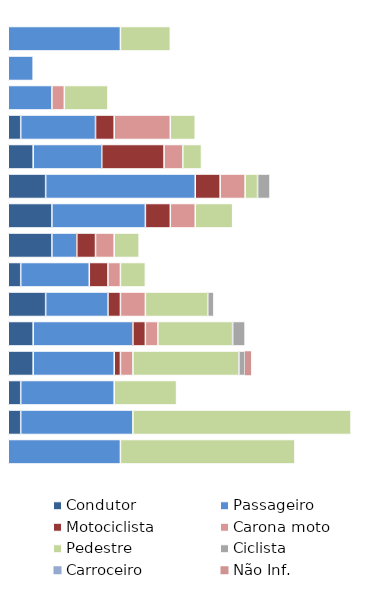
| Category | Condutor | Passageiro | Motociclista | Carona moto | Pedestre | Ciclista | Carroceiro | Não Inf. |
|---|---|---|---|---|---|---|---|---|
| 0-10 | 0 | 18 | 0 | 0 | 8 | 0 | 0 | 0 |
| 11-14 | 0 | 4 | 0 | 0 | 0 | 0 | 0 | 0 |
| 15-17 | 0 | 7 | 0 | 2 | 7 | 0 | 0 | 0 |
| 18-20 | 2 | 12 | 3 | 9 | 4 | 0 | 0 | 0 |
| 21-24 | 4 | 11 | 10 | 3 | 3 | 0 | 0 | 0 |
| 25-29 | 6 | 24 | 4 | 4 | 2 | 2 | 0 | 0 |
| 30-34 | 7 | 15 | 4 | 4 | 6 | 0 | 0 | 0 |
| 35-39 | 7 | 4 | 3 | 3 | 4 | 0 | 0 | 0 |
| 40-44 | 2 | 11 | 3 | 2 | 4 | 0 | 0 | 0 |
| 45-49 | 6 | 10 | 2 | 4 | 10 | 1 | 0 | 0 |
| 50-54 | 4 | 16 | 2 | 2 | 12 | 2 | 0 | 0 |
| 55-59 | 4 | 13 | 1 | 2 | 17 | 1 | 0 | 1 |
| 60-64 | 2 | 15 | 0 | 0 | 10 | 0 | 0 | 0 |
| 65-74 | 2 | 18 | 0 | 0 | 35 | 0 | 0 | 0 |
| 75+ | 0 | 18 | 0 | 0 | 28 | 0 | 0 | 0 |
| NI | 0 | 0 | 0 | 0 | 0 | 0 | 0 | 0 |